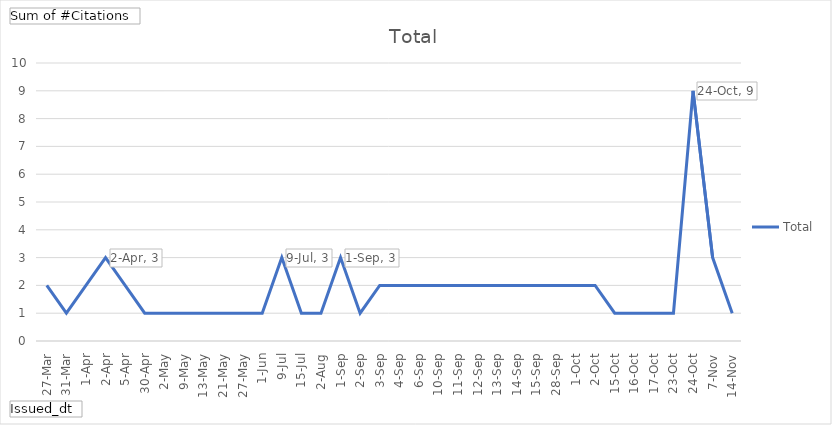
| Category | Total |
|---|---|
| 27-Mar | 2 |
| 31-Mar | 1 |
| 1-Apr | 2 |
| 2-Apr | 3 |
| 5-Apr | 2 |
| 30-Apr | 1 |
| 2-May | 1 |
| 9-May | 1 |
| 13-May | 1 |
| 21-May | 1 |
| 27-May | 1 |
| 1-Jun | 1 |
| 9-Jul | 3 |
| 15-Jul | 1 |
| 2-Aug | 1 |
| 1-Sep | 3 |
| 2-Sep | 1 |
| 3-Sep | 2 |
| 4-Sep | 2 |
| 6-Sep | 2 |
| 10-Sep | 2 |
| 11-Sep | 2 |
| 12-Sep | 2 |
| 13-Sep | 2 |
| 14-Sep | 2 |
| 15-Sep | 2 |
| 28-Sep | 2 |
| 1-Oct | 2 |
| 2-Oct | 2 |
| 15-Oct | 1 |
| 16-Oct | 1 |
| 17-Oct | 1 |
| 23-Oct | 1 |
| 24-Oct | 9 |
| 7-Nov | 3 |
| 14-Nov | 1 |